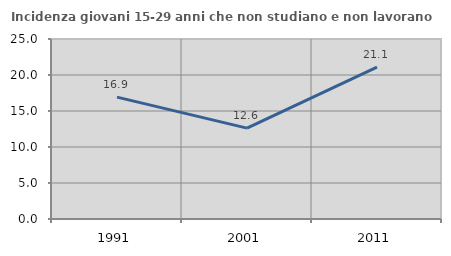
| Category | Incidenza giovani 15-29 anni che non studiano e non lavorano  |
|---|---|
| 1991.0 | 16.93 |
| 2001.0 | 12.621 |
| 2011.0 | 21.094 |